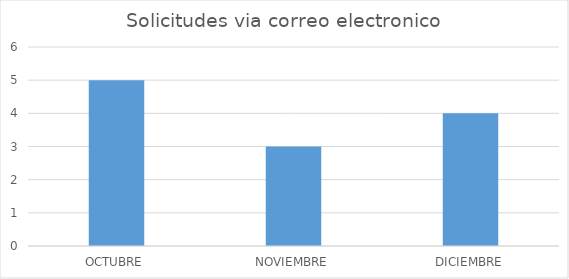
| Category | Series 0 |
|---|---|
| OCTUBRE | 5 |
| NOVIEMBRE | 3 |
| DICIEMBRE | 4 |